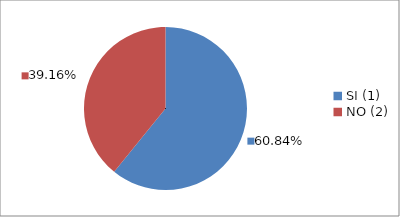
| Category | Series 0 |
|---|---|
| SI (1) | 0.608 |
| NO (2) | 0.392 |